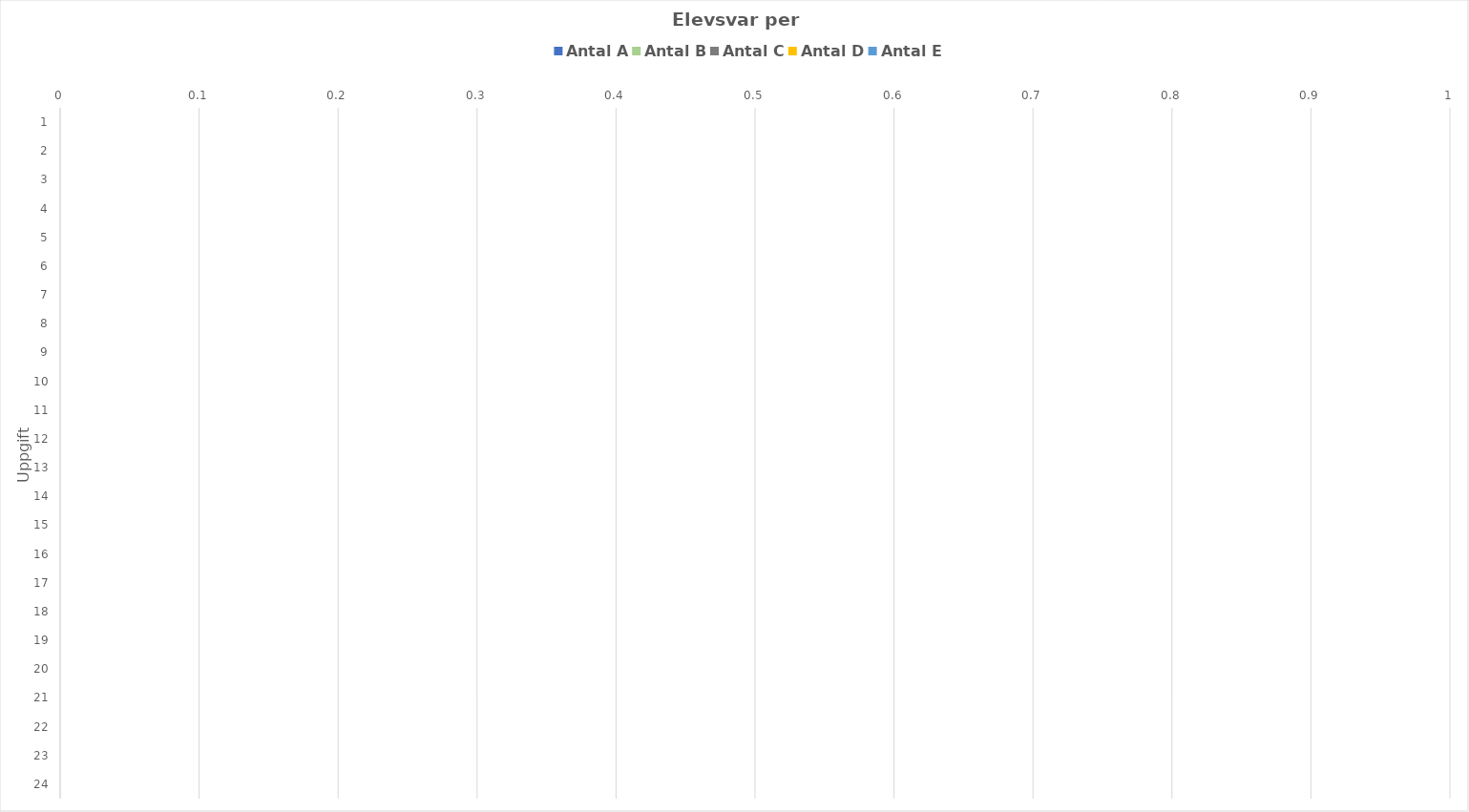
| Category | Antal A | Antal B | Antal C | Antal D | Antal E |
|---|---|---|---|---|---|
| 0 | 0 | 0 | 0 | 0 | 0 |
| 1 | 0 | 0 | 0 | 0 | 0 |
| 2 | 0 | 0 | 0 | 0 | 0 |
| 3 | 0 | 0 | 0 | 0 | 0 |
| 4 | 0 | 0 | 0 | 0 | 0 |
| 5 | 0 | 0 | 0 | 0 | 0 |
| 6 | 0 | 0 | 0 | 0 | 0 |
| 7 | 0 | 0 | 0 | 0 | 0 |
| 8 | 0 | 0 | 0 | 0 | 0 |
| 9 | 0 | 0 | 0 | 0 | 0 |
| 10 | 0 | 0 | 0 | 0 | 0 |
| 11 | 0 | 0 | 0 | 0 | 0 |
| 12 | 0 | 0 | 0 | 0 | 0 |
| 13 | 0 | 0 | 0 | 0 | 0 |
| 14 | 0 | 0 | 0 | 0 | 0 |
| 15 | 0 | 0 | 0 | 0 | 0 |
| 16 | 0 | 0 | 0 | 0 | 0 |
| 17 | 0 | 0 | 0 | 0 | 0 |
| 18 | 0 | 0 | 0 | 0 | 0 |
| 19 | 0 | 0 | 0 | 0 | 0 |
| 20 | 0 | 0 | 0 | 0 | 0 |
| 21 | 0 | 0 | 0 | 0 | 0 |
| 22 | 0 | 0 | 0 | 0 | 0 |
| 23 | 0 | 0 | 0 | 0 | 0 |